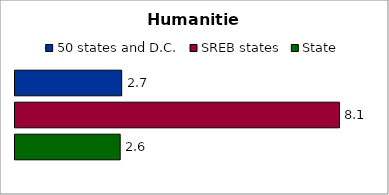
| Category | 50 states and D.C. | SREB states | State |
|---|---|---|---|
| 0 | 2.675 | 8.134 | 2.637 |